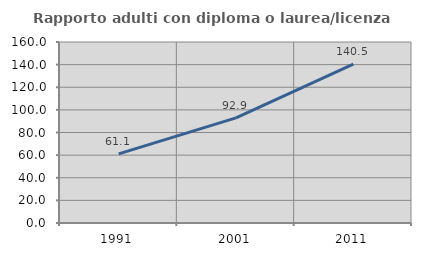
| Category | Rapporto adulti con diploma o laurea/licenza media  |
|---|---|
| 1991.0 | 61.081 |
| 2001.0 | 92.885 |
| 2011.0 | 140.524 |